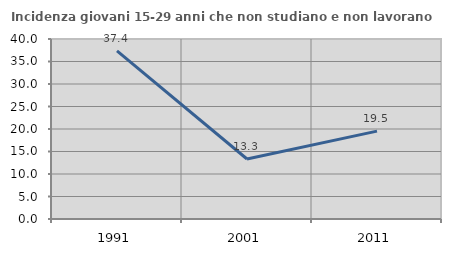
| Category | Incidenza giovani 15-29 anni che non studiano e non lavorano  |
|---|---|
| 1991.0 | 37.363 |
| 2001.0 | 13.333 |
| 2011.0 | 19.531 |